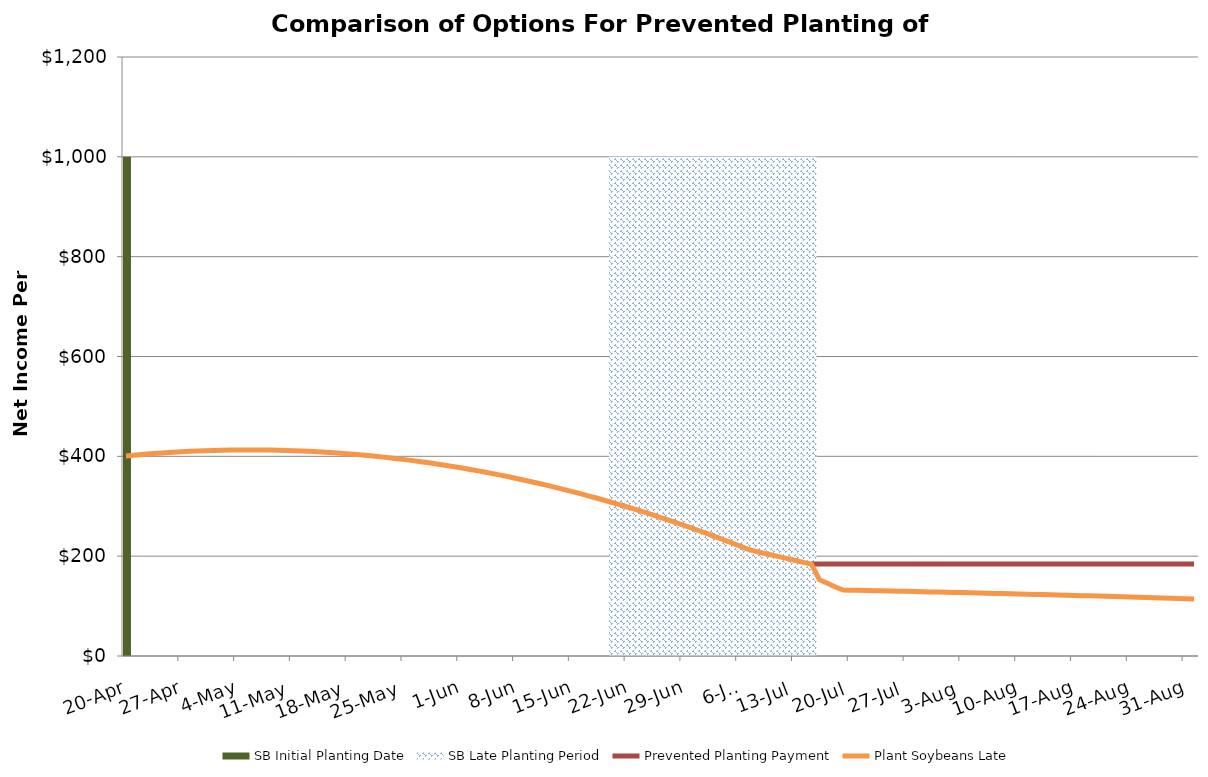
| Category | SB Initial Planting Date | SB Late Planting Period |
|---|---|---|
| 2019-04-20 | 1000 | 0 |
| 2019-04-21 | 0 | 0 |
| 2019-04-22 | 0 | 0 |
| 2019-04-23 | 0 | 0 |
| 2019-04-24 | 0 | 0 |
| 2019-04-25 | 0 | 0 |
| 2019-04-26 | 0 | 0 |
| 2019-04-27 | 0 | 0 |
| 2019-04-28 | 0 | 0 |
| 2019-04-29 | 0 | 0 |
| 2019-04-30 | 0 | 0 |
| 2019-05-01 | 0 | 0 |
| 2019-05-02 | 0 | 0 |
| 2019-05-03 | 0 | 0 |
| 2019-05-04 | 0 | 0 |
| 2019-05-05 | 0 | 0 |
| 2019-05-06 | 0 | 0 |
| 2019-05-07 | 0 | 0 |
| 2019-05-08 | 0 | 0 |
| 2019-05-09 | 0 | 0 |
| 2019-05-10 | 0 | 0 |
| 2019-05-11 | 0 | 0 |
| 2019-05-12 | 0 | 0 |
| 2019-05-13 | 0 | 0 |
| 2019-05-14 | 0 | 0 |
| 2019-05-15 | 0 | 0 |
| 2019-05-16 | 0 | 0 |
| 2019-05-17 | 0 | 0 |
| 2019-05-18 | 0 | 0 |
| 2019-05-19 | 0 | 0 |
| 2019-05-20 | 0 | 0 |
| 2019-05-21 | 0 | 0 |
| 2019-05-22 | 0 | 0 |
| 2019-05-23 | 0 | 0 |
| 2019-05-24 | 0 | 0 |
| 2019-05-25 | 0 | 0 |
| 2019-05-26 | 0 | 0 |
| 2019-05-27 | 0 | 0 |
| 2019-05-28 | 0 | 0 |
| 2019-05-29 | 0 | 0 |
| 2019-05-30 | 0 | 0 |
| 2019-05-31 | 0 | 0 |
| 2019-06-01 | 0 | 0 |
| 2019-06-02 | 0 | 0 |
| 2019-06-03 | 0 | 0 |
| 2019-06-04 | 0 | 0 |
| 2019-06-05 | 0 | 0 |
| 2019-06-06 | 0 | 0 |
| 2019-06-07 | 0 | 0 |
| 2019-06-08 | 0 | 0 |
| 2019-06-09 | 0 | 0 |
| 2019-06-10 | 0 | 0 |
| 2019-06-11 | 0 | 0 |
| 2019-06-12 | 0 | 0 |
| 2019-06-13 | 0 | 0 |
| 2019-06-14 | 0 | 0 |
| 2019-06-15 | 0 | 0 |
| 2019-06-16 | 0 | 0 |
| 2019-06-17 | 0 | 0 |
| 2019-06-18 | 0 | 0 |
| 2019-06-19 | 0 | 0 |
| 2019-06-20 | 0 | 1000 |
| 2019-06-21 | 0 | 1000 |
| 2019-06-22 | 0 | 1000 |
| 2019-06-23 | 0 | 1000 |
| 2019-06-24 | 0 | 1000 |
| 2019-06-25 | 0 | 1000 |
| 2019-06-26 | 0 | 1000 |
| 2019-06-27 | 0 | 1000 |
| 2019-06-28 | 0 | 1000 |
| 2019-06-29 | 0 | 1000 |
| 2019-06-30 | 0 | 1000 |
| 2019-07-01 | 0 | 1000 |
| 2019-07-02 | 0 | 1000 |
| 2019-07-03 | 0 | 1000 |
| 2019-07-04 | 0 | 1000 |
| 2019-07-05 | 0 | 1000 |
| 2019-07-06 | 0 | 1000 |
| 2019-07-07 | 0 | 1000 |
| 2019-07-08 | 0 | 1000 |
| 2019-07-09 | 0 | 1000 |
| 2019-07-10 | 0 | 1000 |
| 2019-07-11 | 0 | 1000 |
| 2019-07-12 | 0 | 1000 |
| 2019-07-13 | 0 | 1000 |
| 2019-07-14 | 0 | 1000 |
| 2019-07-15 | 0 | 1000 |
| 2019-07-16 | 0 | 0 |
| 2019-07-17 | 0 | 0 |
| 2019-07-18 | 0 | 0 |
| 2019-07-19 | 0 | 0 |
| 2019-07-20 | 0 | 0 |
| 2019-07-21 | 0 | 0 |
| 2019-07-22 | 0 | 0 |
| 2019-07-23 | 0 | 0 |
| 2019-07-24 | 0 | 0 |
| 2019-07-25 | 0 | 0 |
| 2019-07-26 | 0 | 0 |
| 2019-07-27 | 0 | 0 |
| 2019-07-28 | 0 | 0 |
| 2019-07-29 | 0 | 0 |
| 2019-07-30 | 0 | 0 |
| 2019-07-31 | 0 | 0 |
| 2019-08-01 | 0 | 0 |
| 2019-08-02 | 0 | 0 |
| 2019-08-03 | 0 | 0 |
| 2019-08-04 | 0 | 0 |
| 2019-08-05 | 0 | 0 |
| 2019-08-06 | 0 | 0 |
| 2019-08-07 | 0 | 0 |
| 2019-08-08 | 0 | 0 |
| 2019-08-09 | 0 | 0 |
| 2019-08-10 | 0 | 0 |
| 2019-08-11 | 0 | 0 |
| 2019-08-12 | 0 | 0 |
| 2019-08-13 | 0 | 0 |
| 2019-08-14 | 0 | 0 |
| 2019-08-15 | 0 | 0 |
| 2019-08-16 | 0 | 0 |
| 2019-08-17 | 0 | 0 |
| 2019-08-18 | 0 | 0 |
| 2019-08-19 | 0 | 0 |
| 2019-08-20 | 0 | 0 |
| 2019-08-21 | 0 | 0 |
| 2019-08-22 | 0 | 0 |
| 2019-08-23 | 0 | 0 |
| 2019-08-24 | 0 | 0 |
| 2019-08-25 | 0 | 0 |
| 2019-08-26 | 0 | 0 |
| 2019-08-27 | 0 | 0 |
| 2019-08-28 | 0 | 0 |
| 2019-08-29 | 0 | 0 |
| 2019-08-30 | 0 | 0 |
| 2019-08-31 | 0 | 0 |
| 2019-09-01 | 0 | 0 |